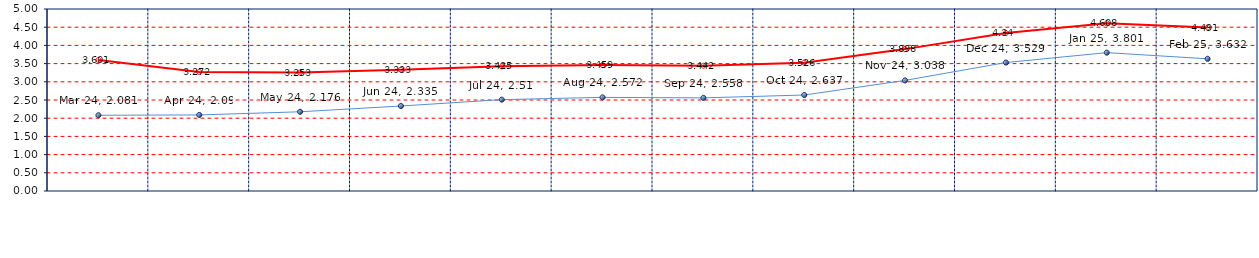
| Category | Last | Historical |
|---|---|---|
| Mar 24 | 2.081 | 3.601 |
| Apr 24 | 2.09 | 3.272 |
| May 24 | 2.176 | 3.253 |
| Jun 24 | 2.335 | 3.333 |
| Jul 24 | 2.51 | 3.425 |
| Aug 24 | 2.572 | 3.459 |
| Sep 24 | 2.558 | 3.442 |
| Oct 24 | 2.637 | 3.526 |
| Nov 24 | 3.038 | 3.898 |
| Dec 24 | 3.529 | 4.34 |
| Jan 25 | 3.801 | 4.608 |
| Feb 25 | 3.632 | 4.491 |